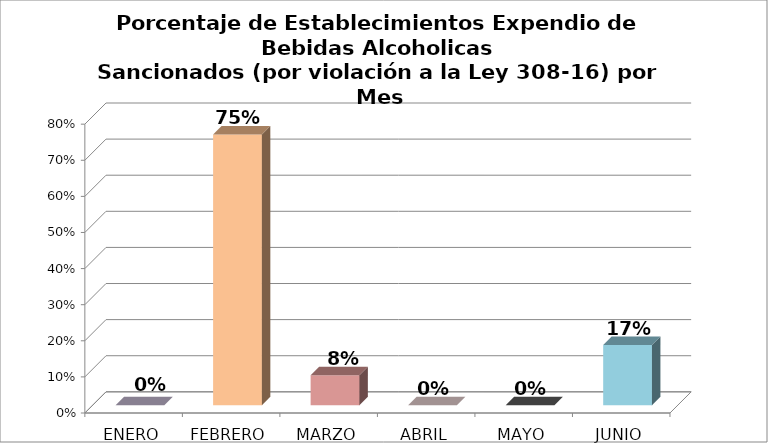
| Category | Series 0 |
|---|---|
| ENERO | 0 |
| FEBRERO | 0.75 |
| MARZO | 0.083 |
| ABRIL | 0 |
| MAYO | 0 |
| JUNIO | 0.167 |